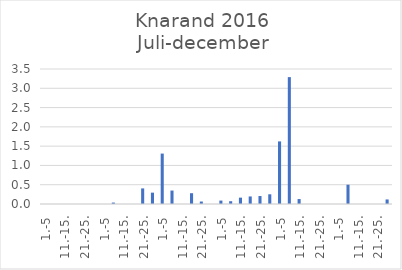
| Category | Series 0 |
|---|---|
| 1.-5 | 0 |
| 6.-10. | 0 |
| 11.-15. | 0 |
| 16.-20. | 0 |
| 21.-25. | 0 |
| 26.-31. | 0 |
| 1.-5 | 0 |
| 6.-10. | 0.037 |
| 11.-15. | 0 |
| 16.-20. | 0 |
| 21.-25. | 0.404 |
| 26.-31. | 0.294 |
| 1.-5 | 1.307 |
| 6.-10. | 0.348 |
| 11.-15. | 0 |
| 16.-20. | 0.28 |
| 21.-25. | 0.064 |
| 26.-30. | 0 |
| 1.-5 | 0.089 |
| 6.-10. | 0.072 |
| 11.-15. | 0.165 |
| 16.-20. | 0.196 |
| 21.-25. | 0.207 |
| 26.-31. | 0.252 |
| 1.-5 | 1.623 |
| 6.-10. | 3.29 |
| 11.-15. | 0.128 |
| 16.-20. | 0 |
| 21.-25. | 0 |
| 26.-30. | 0 |
| 1.-5 | 0 |
| 6.-10. | 0.5 |
| 11.-15. | 0 |
| 16.-20. | 0 |
| 21.-25. | 0 |
| 26.-31. | 0.118 |